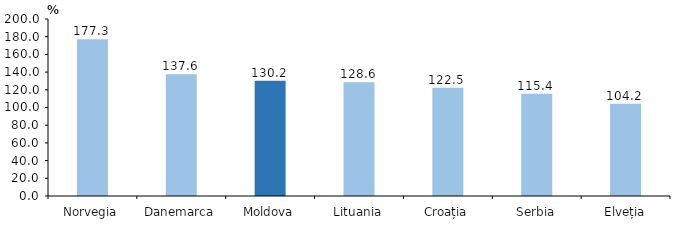
| Category | Indicilor preţurilor producţiei industriale, august 2022 comparativ cu august 2021 |
|---|---|
| Norvegia | 177.25 |
| Danemarca | 137.575 |
| Moldova | 130.2 |
| Lituania | 128.571 |
| Croația | 122.455 |
| Serbia | 115.405 |
| Elveția | 104.225 |